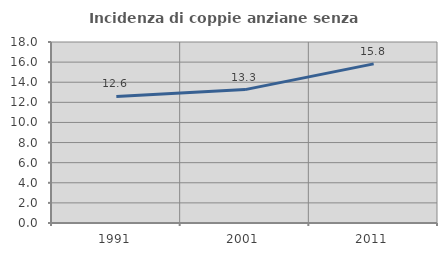
| Category | Incidenza di coppie anziane senza figli  |
|---|---|
| 1991.0 | 12.585 |
| 2001.0 | 13.265 |
| 2011.0 | 15.822 |